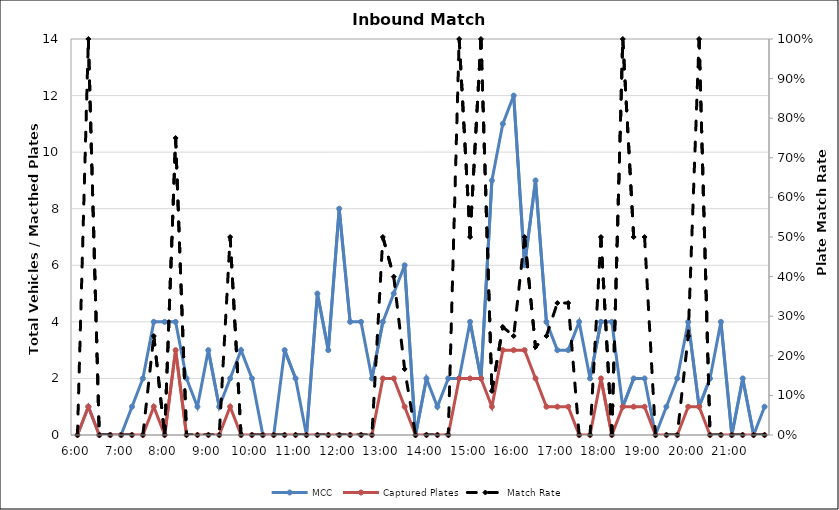
| Category | MCC | Captured Plates |
|---|---|---|
| 0.25 | 0 | 0 |
| 0.260416666666667 | 1 | 1 |
| 0.270833333333333 | 0 | 0 |
| 0.28125 | 0 | 0 |
| 0.291666666666667 | 0 | 0 |
| 0.302083333333333 | 1 | 0 |
| 0.3125 | 2 | 0 |
| 0.322916666666667 | 4 | 1 |
| 0.333333333333333 | 4 | 0 |
| 0.34375 | 4 | 3 |
| 0.354166666666667 | 2 | 0 |
| 0.364583333333333 | 1 | 0 |
| 0.375 | 3 | 0 |
| 0.385416666666667 | 1 | 0 |
| 0.395833333333333 | 2 | 1 |
| 0.40625 | 3 | 0 |
| 0.416666666666667 | 2 | 0 |
| 0.427083333333333 | 0 | 0 |
| 0.4375 | 0 | 0 |
| 0.447916666666667 | 3 | 0 |
| 0.458333333333333 | 2 | 0 |
| 0.46875 | 0 | 0 |
| 0.479166666666667 | 5 | 0 |
| 0.489583333333333 | 3 | 0 |
| 0.5 | 8 | 0 |
| 0.510416666666667 | 4 | 0 |
| 0.520833333333333 | 4 | 0 |
| 0.53125 | 2 | 0 |
| 0.541666666666667 | 4 | 2 |
| 0.552083333333333 | 5 | 2 |
| 0.5625 | 6 | 1 |
| 0.572916666666667 | 0 | 0 |
| 0.583333333333333 | 2 | 0 |
| 0.59375 | 1 | 0 |
| 0.604166666666667 | 2 | 0 |
| 0.614583333333333 | 2 | 2 |
| 0.625 | 4 | 2 |
| 0.635416666666667 | 2 | 2 |
| 0.645833333333333 | 9 | 1 |
| 0.65625 | 11 | 3 |
| 0.666666666666667 | 12 | 3 |
| 0.677083333333333 | 6 | 3 |
| 0.6875 | 9 | 2 |
| 0.697916666666667 | 4 | 1 |
| 0.708333333333333 | 3 | 1 |
| 0.71875 | 3 | 1 |
| 0.729166666666667 | 4 | 0 |
| 0.739583333333333 | 2 | 0 |
| 0.75 | 4 | 2 |
| 0.760416666666667 | 4 | 0 |
| 0.770833333333333 | 1 | 1 |
| 0.78125 | 2 | 1 |
| 0.791666666666667 | 2 | 1 |
| 0.802083333333333 | 0 | 0 |
| 0.8125 | 1 | 0 |
| 0.822916666666667 | 2 | 0 |
| 0.833333333333333 | 4 | 1 |
| 0.84375 | 1 | 1 |
| 0.854166666666667 | 2 | 0 |
| 0.864583333333333 | 4 | 0 |
| 0.875 | 0 | 0 |
| 0.885416666666667 | 2 | 0 |
| 0.895833333333333 | 0 | 0 |
| 0.90625 | 1 | 0 |